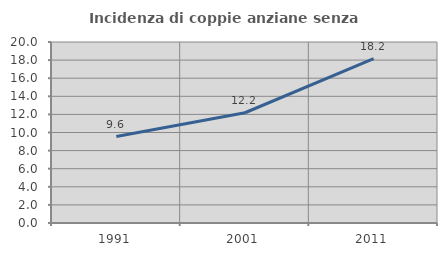
| Category | Incidenza di coppie anziane senza figli  |
|---|---|
| 1991.0 | 9.552 |
| 2001.0 | 12.183 |
| 2011.0 | 18.156 |